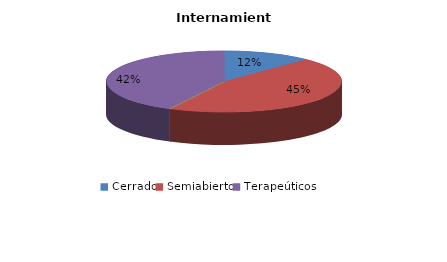
| Category | Series 0 |
|---|---|
| Cerrado | 4 |
| Semiabierto | 15 |
| Abierto | 0 |
| Terapeúticos | 14 |